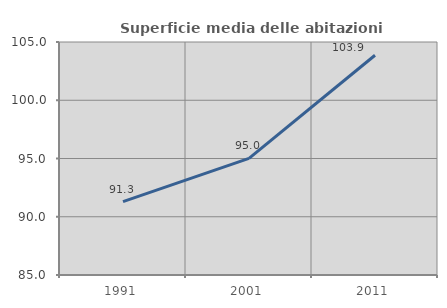
| Category | Superficie media delle abitazioni occupate |
|---|---|
| 1991.0 | 91.298 |
| 2001.0 | 95.006 |
| 2011.0 | 103.863 |